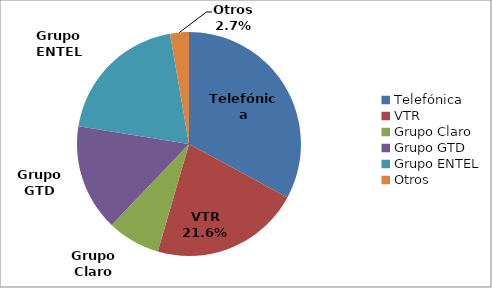
| Category | Series 0 |
|---|---|
| Telefónica | 651027 |
| VTR | 426717 |
| Grupo Claro | 151196 |
| Grupo GTD | 304487 |
| Grupo ENTEL | 390502 |
| Otros | 53728 |